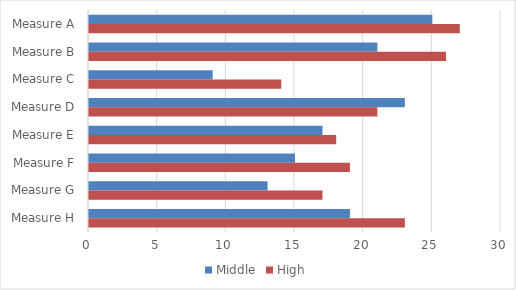
| Category | Middle | High |
|---|---|---|
| Measure A | 25 | 27 |
| Measure B | 21 | 26 |
| Measure C | 9 | 14 |
| Measure D | 23 | 21 |
| Measure E | 17 | 18 |
| Measure F | 15 | 19 |
| Measure G | 13 | 17 |
| Measure H | 19 | 23 |